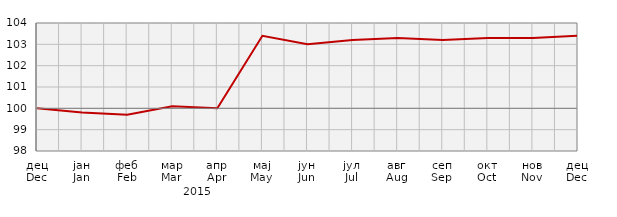
| Category | Индекси цијена произвођача
Producer price indices |
|---|---|
| дец
Dec | 100 |
| јан
Jan | 99.8 |
| феб
Feb | 99.7 |
| мар
Mar | 100.1 |
| апр
Apr | 100 |
| мај
May | 103.4 |
| јун
Jun | 103 |
| јул
Jul | 103.2 |
| авг
Aug | 103.3 |
| сеп
Sep | 103.2 |
| окт
Oct | 103.3 |
| нов
Nov | 103.3 |
| дец
Dec | 103.4 |